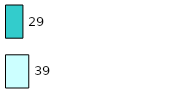
| Category | Series 0 | Series 1 |
|---|---|---|
| 0 | 39 | 29 |